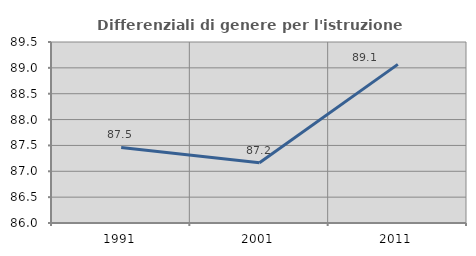
| Category | Differenziali di genere per l'istruzione superiore |
|---|---|
| 1991.0 | 87.46 |
| 2001.0 | 87.165 |
| 2011.0 | 89.067 |